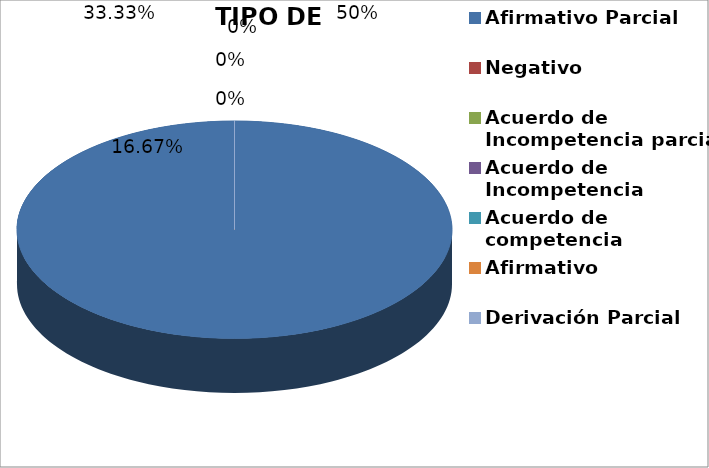
| Category | Series 0 |
|---|---|
| Afirmativo Parcial | 1 |
| Negativo | 0 |
| Acuerdo de Incompetencia parcial | 0 |
| Acuerdo de Incompetencia | 0 |
| Acuerdo de competencia | 0 |
| Afirmativo | 0 |
| Derivación Parcial | 0 |